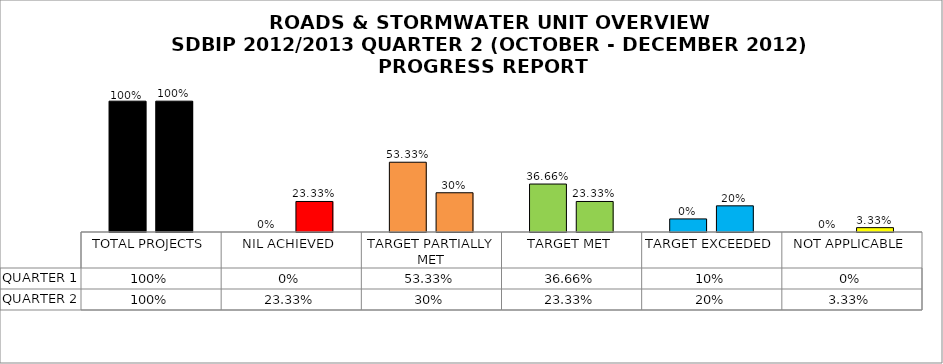
| Category | QUARTER 1 | QUARTER 2 |
|---|---|---|
| TOTAL PROJECTS | 1 | 1 |
| NIL ACHIEVED | 0 | 0.233 |
| TARGET PARTIALLY MET | 0.533 | 0.3 |
| TARGET MET | 0.367 | 0.233 |
| TARGET EXCEEDED | 0.1 | 0.2 |
| NOT APPLICABLE | 0 | 0.033 |